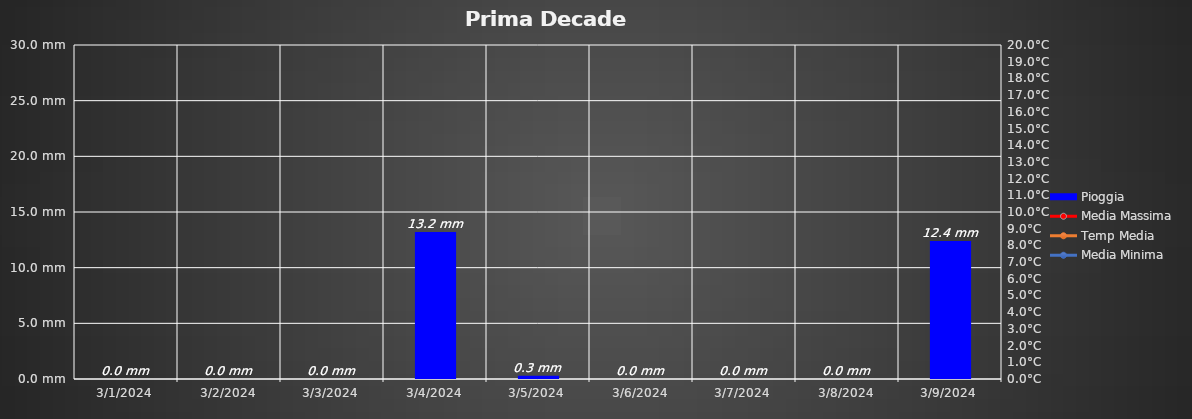
| Category | Pioggia |
|---|---|
| 3/1/24 | 0 |
| 3/2/24 | 0 |
| 3/3/24 | 0 |
| 3/4/24 | 1900-01-13 04:48:00 |
| 3/5/24 | 0.3 |
| 3/6/24 | 0 |
| 3/7/24 | 0 |
| 3/8/24 | 0 |
| 3/9/24 | 1900-01-12 09:36:00 |